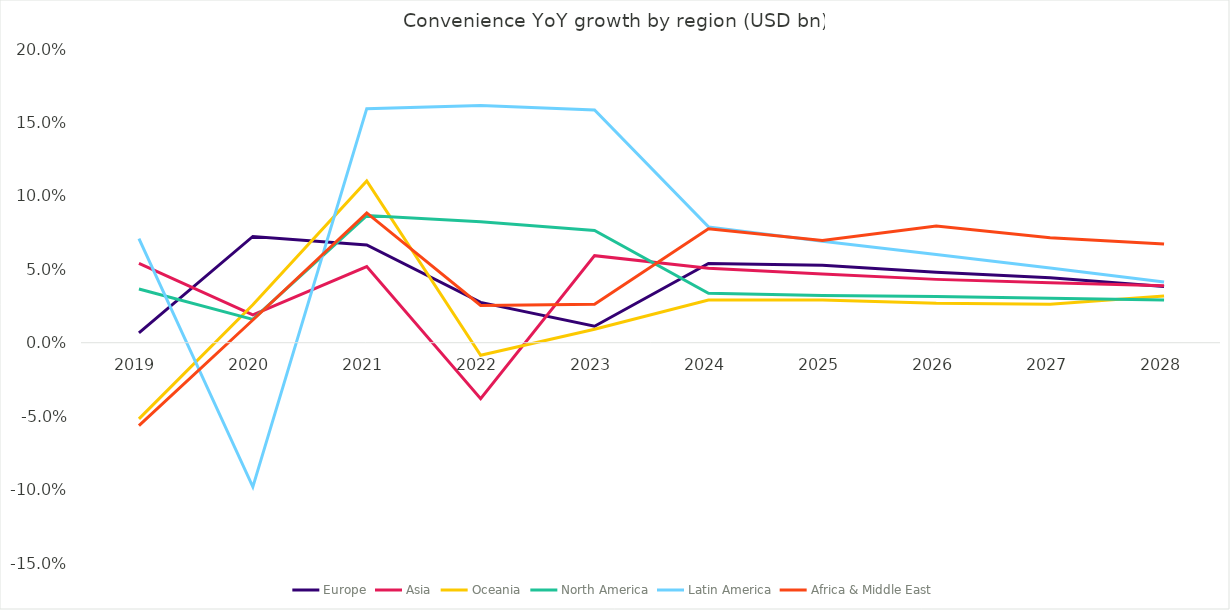
| Category | Europe | Asia | Oceania | North America | Latin America | Africa & Middle East |
|---|---|---|---|---|---|---|
| 2019.0 | 0.007 | 0.054 | -0.052 | 0.037 | 0.071 | -0.056 |
| 2020.0 | 0.072 | 0.019 | 0.026 | 0.016 | -0.098 | 0.015 |
| 2021.0 | 0.067 | 0.052 | 0.11 | 0.087 | 0.159 | 0.088 |
| 2022.0 | 0.027 | -0.038 | -0.009 | 0.082 | 0.162 | 0.025 |
| 2023.0 | 0.011 | 0.059 | 0.009 | 0.076 | 0.158 | 0.026 |
| 2024.0 | 0.054 | 0.051 | 0.029 | 0.034 | 0.079 | 0.078 |
| 2025.0 | 0.053 | 0.047 | 0.029 | 0.032 | 0.069 | 0.07 |
| 2026.0 | 0.048 | 0.043 | 0.027 | 0.031 | 0.06 | 0.08 |
| 2027.0 | 0.044 | 0.041 | 0.026 | 0.03 | 0.051 | 0.071 |
| 2028.0 | 0.038 | 0.039 | 0.032 | 0.029 | 0.041 | 0.067 |